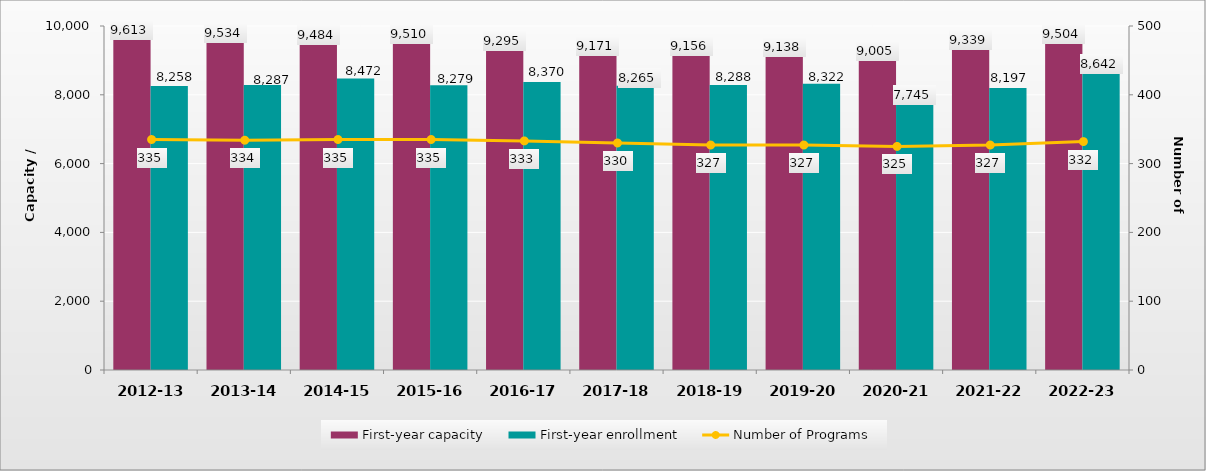
| Category | First-year capacity | First-year enrollment |
|---|---|---|
| 2012-13 | 9613 | 8258 |
| 2013-14 | 9534 | 8287 |
| 2014-15 | 9484 | 8472 |
| 2015-16 | 9510 | 8279 |
| 2016-17 | 9295 | 8370 |
| 2017-18 | 9171 | 8265 |
| 2018-19 | 9156 | 8288 |
| 2019-20 | 9138 | 8322 |
| 2020-21 | 9005 | 7745 |
| 2021-22 | 9339 | 8197 |
| 2022-23 | 9504 | 8642 |